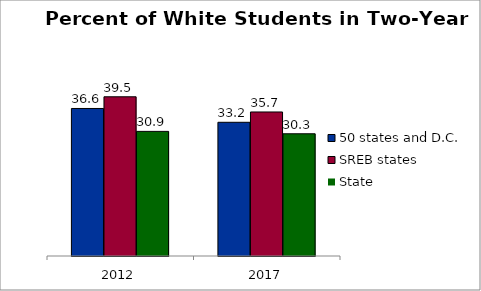
| Category | 50 states and D.C. | SREB states | State |
|---|---|---|---|
| 2012.0 | 36.577 | 39.474 | 30.896 |
| 2017.0 | 33.15 | 35.709 | 30.303 |